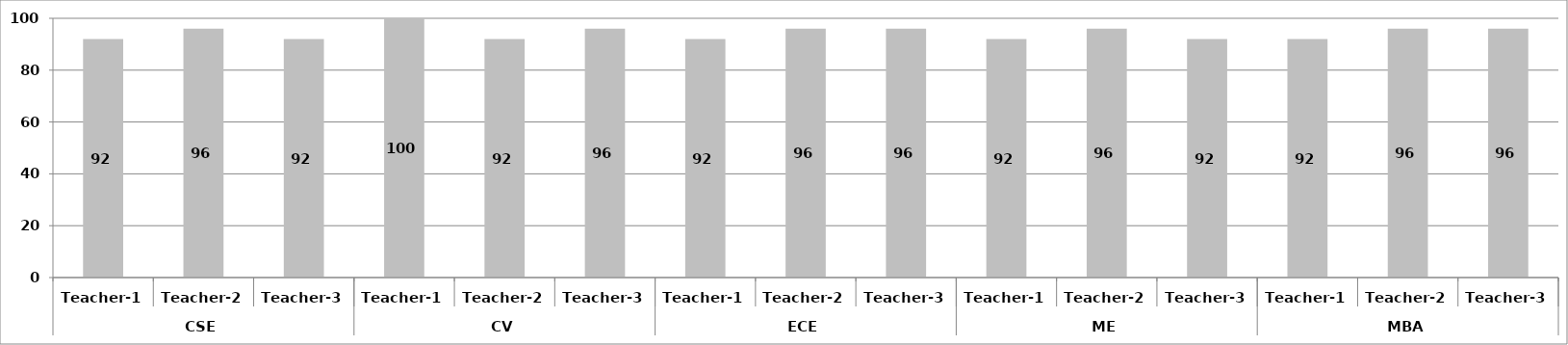
| Category | Series 0 |
|---|---|
| 0 | 92 |
| 1 | 96 |
| 2 | 92 |
| 3 | 100 |
| 4 | 92 |
| 5 | 96 |
| 6 | 92 |
| 7 | 96 |
| 8 | 96 |
| 9 | 92 |
| 10 | 96 |
| 11 | 92 |
| 12 | 92 |
| 13 | 96 |
| 14 | 96 |